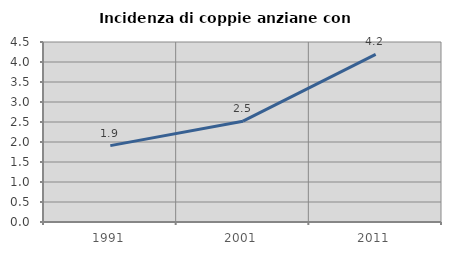
| Category | Incidenza di coppie anziane con figli |
|---|---|
| 1991.0 | 1.909 |
| 2001.0 | 2.52 |
| 2011.0 | 4.191 |